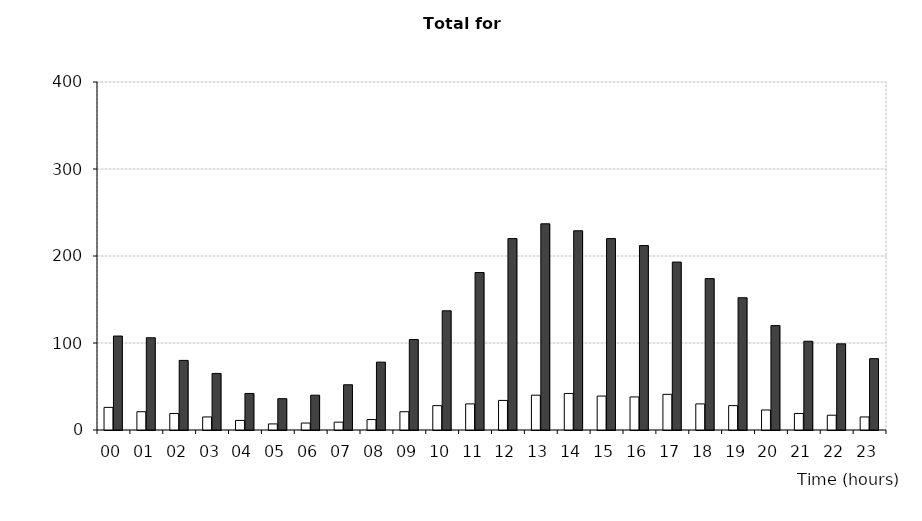
| Category | Fatal/Serious | All severities |
|---|---|---|
| 00 | 26 | 108 |
| 01 | 21 | 106 |
| 02 | 19 | 80 |
| 03 | 15 | 65 |
| 04 | 11 | 42 |
| 05 | 7 | 36 |
| 06 | 8 | 40 |
| 07 | 9 | 52 |
| 08 | 12 | 78 |
| 09 | 21 | 104 |
| 10 | 28 | 137 |
| 11 | 30 | 181 |
| 12 | 34 | 220 |
| 13 | 40 | 237 |
| 14 | 42 | 229 |
| 15 | 39 | 220 |
| 16 | 38 | 212 |
| 17 | 41 | 193 |
| 18 | 30 | 174 |
| 19 | 28 | 152 |
| 20 | 23 | 120 |
| 21 | 19 | 102 |
| 22 | 17 | 99 |
| 23 | 15 | 82 |